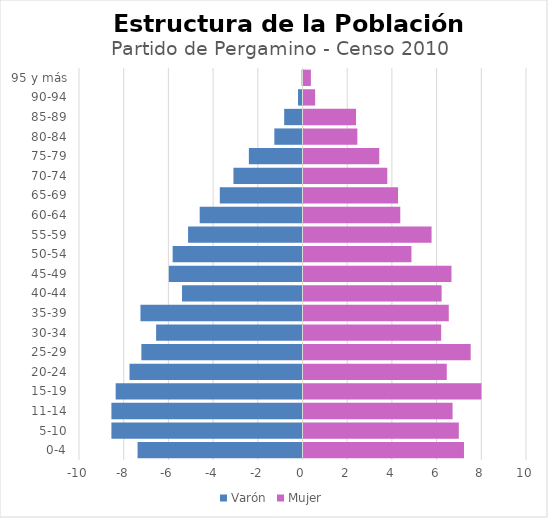
| Category | Varón | Mujer |
|---|---|---|
| 0-4 | -7.38 | 7.18 |
| 5-10 | -8.55 | 6.95 |
| 11-14 | -8.55 | 6.67 |
| 15-19 | -8.36 | 7.96 |
| 20-24 | -7.74 | 6.41 |
| 25-29 | -7.21 | 7.48 |
| 30-34 | -6.55 | 6.16 |
| 35-39 | -7.25 | 6.5 |
| 40-44 | -5.39 | 6.18 |
| 45-49 | -5.98 | 6.62 |
| 50-54 | -5.81 | 4.83 |
| 55-59 | -5.12 | 5.73 |
| 60-64 | -4.6 | 4.33 |
| 65-69 | -3.7 | 4.23 |
| 70-74 | -3.09 | 3.75 |
| 75-79 | -2.4 | 3.39 |
| 80-84 | -1.26 | 2.41 |
| 85-89 | -0.82 | 2.35 |
| 90-94 | -0.2 | 0.52 |
| 95 y más | -0.04 | 0.33 |